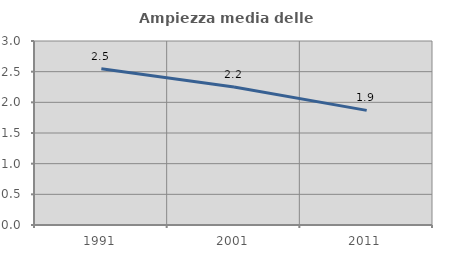
| Category | Ampiezza media delle famiglie |
|---|---|
| 1991.0 | 2.546 |
| 2001.0 | 2.249 |
| 2011.0 | 1.869 |